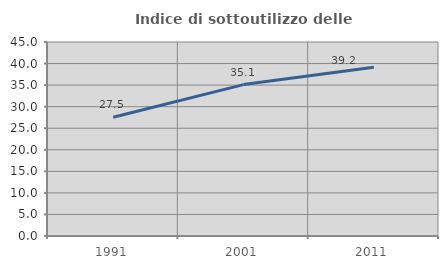
| Category | Indice di sottoutilizzo delle abitazioni  |
|---|---|
| 1991.0 | 27.545 |
| 2001.0 | 35.123 |
| 2011.0 | 39.16 |